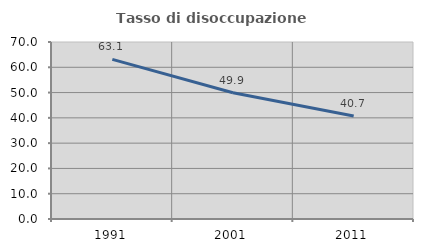
| Category | Tasso di disoccupazione giovanile  |
|---|---|
| 1991.0 | 63.137 |
| 2001.0 | 49.925 |
| 2011.0 | 40.727 |